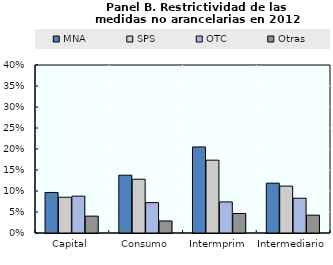
| Category | MNA | SPS | OTC | Otras |
|---|---|---|---|---|
| Capital | 0.097 | 0.085 | 0.088 | 0.04 |
| Consumo | 0.138 | 0.128 | 0.072 | 0.029 |
| Intermprim | 0.205 | 0.173 | 0.074 | 0.046 |
| Intermediario | 0.119 | 0.112 | 0.083 | 0.042 |